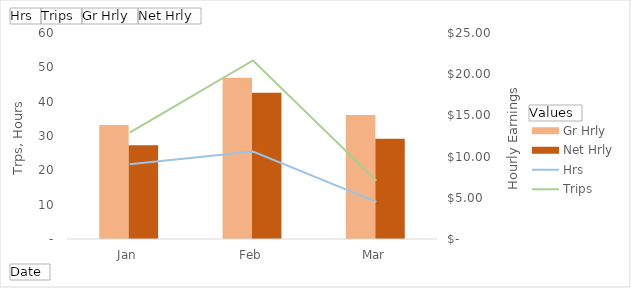
| Category | Gr Hrly | Net Hrly |
|---|---|---|
| Jan | 13.834 | 11.368 |
| Feb | 19.571 | 17.761 |
| Mar | 15.054 | 12.162 |